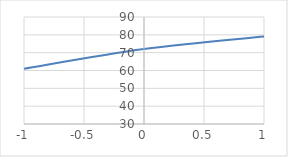
| Category | Series 0 |
|---|---|
| -1.0 | 61 |
| 0.0 | 72 |
| 1.0 | 79 |